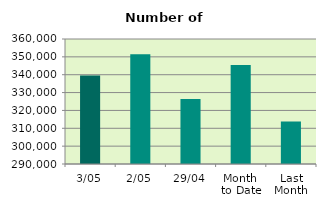
| Category | Series 0 |
|---|---|
| 3/05 | 339538 |
| 2/05 | 351478 |
| 29/04 | 326424 |
| Month 
to Date | 345508 |
| Last
Month | 313751.158 |